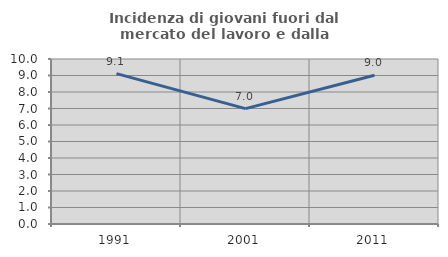
| Category | Incidenza di giovani fuori dal mercato del lavoro e dalla formazione  |
|---|---|
| 1991.0 | 9.113 |
| 2001.0 | 6.993 |
| 2011.0 | 9.011 |